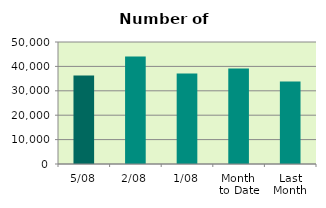
| Category | Series 0 |
|---|---|
| 5/08 | 36284 |
| 2/08 | 44052 |
| 1/08 | 37138 |
| Month 
to Date | 39158 |
| Last
Month | 33803.652 |